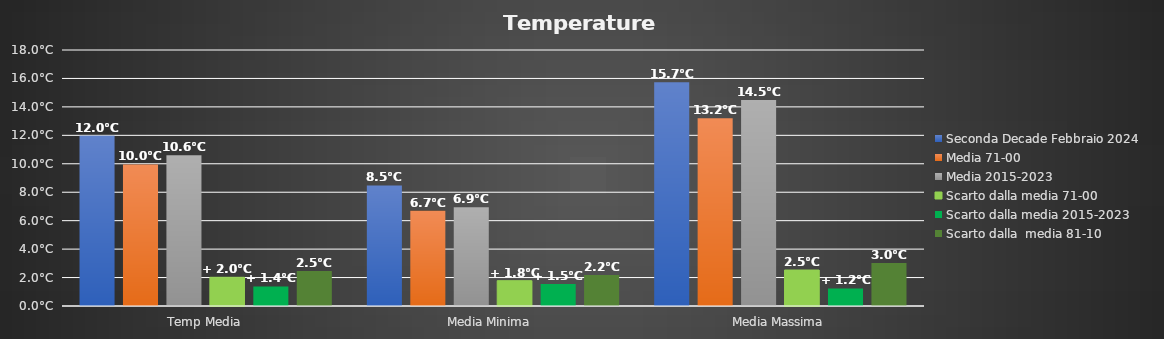
| Category | Seconda Decade Febbraio 2024 | Media 71-00 | Media 2015-2023 | Scarto dalla media 71-00 | Scarto dalla media 2015-2023 | Scarto dalla  media 81-10 |
|---|---|---|---|---|---|---|
| Temp Media | 11.969 | 9.95 | 10.598 | 2.019 | 1.371 | 2.469 |
| Media Minima  | 8.48 | 6.7 | 6.939 | 1.78 | 1.541 | 2.18 |
| Media Massima | 15.73 | 13.2 | 14.492 | 2.53 | 1.238 | 3.03 |